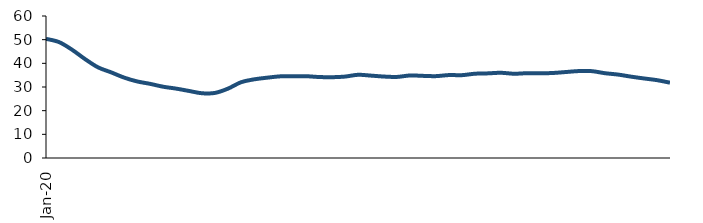
| Category | Series 0 |
|---|---|
| 2020-01-01 | 50.348 |
| 2020-02-01 | 48.978 |
| 2020-03-01 | 45.766 |
| 2020-04-01 | 41.808 |
| 2020-05-01 | 38.31 |
| 2020-06-01 | 36.214 |
| 2020-07-01 | 33.993 |
| 2020-08-01 | 32.365 |
| 2020-09-01 | 31.338 |
| 2020-10-01 | 30.13 |
| 2020-11-01 | 29.326 |
| 2020-12-01 | 28.333 |
| 2021-01-01 | 27.356 |
| 2021-02-01 | 27.502 |
| 2021-03-01 | 29.312 |
| 2021-04-01 | 32.007 |
| 2021-05-01 | 33.224 |
| 2021-06-01 | 33.927 |
| 2021-07-01 | 34.496 |
| 2021-08-01 | 34.565 |
| 2021-09-01 | 34.562 |
| 2021-10-01 | 34.221 |
| 2021-11-01 | 34.137 |
| 2021-12-01 | 34.397 |
| 2022-01-01 | 35.154 |
| 2022-02-01 | 34.808 |
| 2022-03-01 | 34.415 |
| 2022-04-01 | 34.261 |
| 2022-05-01 | 34.87 |
| 2022-06-01 | 34.705 |
| 2022-07-01 | 34.592 |
| 2022-08-01 | 35.045 |
| 2022-09-01 | 35.003 |
| 2022-10-01 | 35.616 |
| 2022-11-01 | 35.763 |
| 2022-12-01 | 36.005 |
| 2023-01-01 | 35.604 |
| 2023-02-01 | 35.827 |
| 2023-03-01 | 35.769 |
| 2023-04-01 | 35.924 |
| 2023-05-01 | 36.331 |
| 2023-06-01 | 36.74 |
| 2023-07-01 | 36.693 |
| 2023-08-01 | 35.824 |
| 2023-09-01 | 35.253 |
| 2023-10-01 | 34.375 |
| 2023-11-01 | 33.606 |
| 2023-12-01 | 32.893 |
| 2024-01-01 | 31.825 |